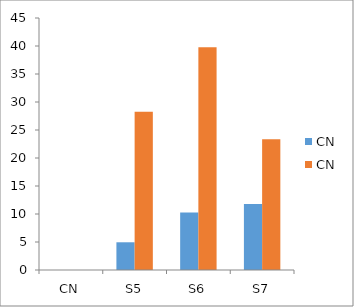
| Category | CN |
|---|---|
| CN | 0 |
| S5 | 28.26 |
| S6 | 39.76 |
| S7 | 23.37 |